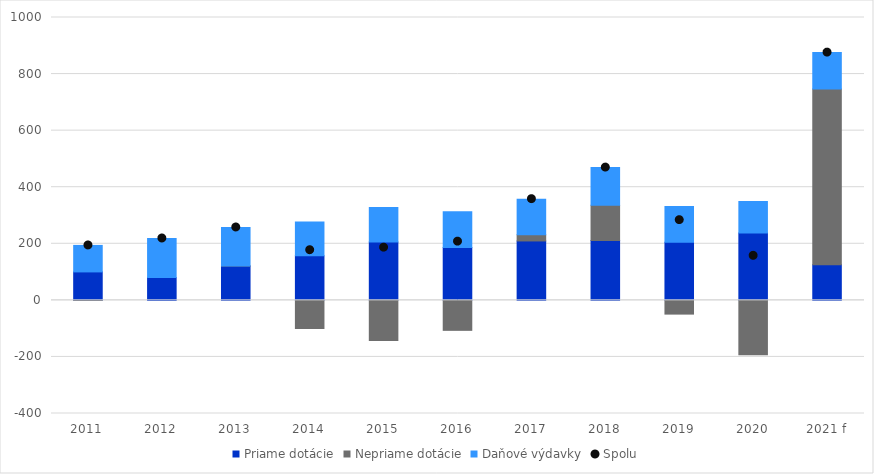
| Category | Priame dotácie | Nepriame dotácie | Daňové výdavky |
|---|---|---|---|
| 2011 | 100.57 | -0.099 | 93.666 |
| 2012 | 80.574 | 0 | 138.189 |
| 2013 | 121.32 | 0 | 136.383 |
| 2014 | 158.092 | -99.472 | 118.721 |
| 2015 | 206.158 | -142.077 | 122.208 |
| 2016 | 187.253 | -106.006 | 126.313 |
| 2017 | 209.997 | 22.004 | 125.836 |
| 2018 | 211.704 | 124.716 | 133.008 |
| 2019 | 205.05 | -48.615 | 127.152 |
| 2020 | 238.492 | -192.452 | 111.41 |
| 2021 f | 125.455 | 621.701 | 128.768 |